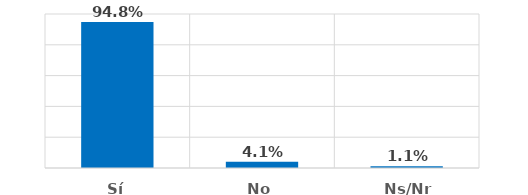
| Category | Series 0 |
|---|---|
| Sí | 0.948 |
| No | 0.041 |
| Ns/Nr | 0.011 |